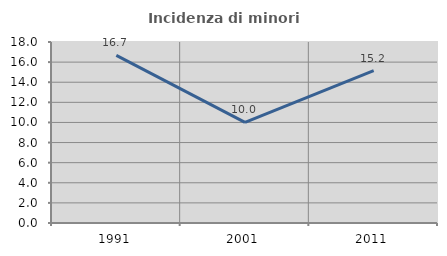
| Category | Incidenza di minori stranieri |
|---|---|
| 1991.0 | 16.667 |
| 2001.0 | 10 |
| 2011.0 | 15.152 |